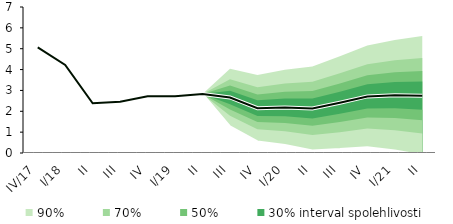
| Category | linka | Centerline |
|---|---|---|
| IV/17 | 5.062 | 5.062 |
| I/18 | 4.225 | 4.225 |
| II | 2.383 | 2.383 |
| III | 2.458 | 2.458 |
| IV | 2.722 | 2.722 |
| I/19 | 2.721 | 2.721 |
| II | 2.831 | 2.831 |
| III | 2.662 | 2.662 |
| IV | 2.148 | 2.148 |
| I/20 | 2.185 | 2.185 |
| II | 2.137 | 2.137 |
| III | 2.41 | 2.41 |
| IV | 2.714 | 2.714 |
| I/21 | 2.771 | 2.771 |
| II | 2.748 | 2.748 |